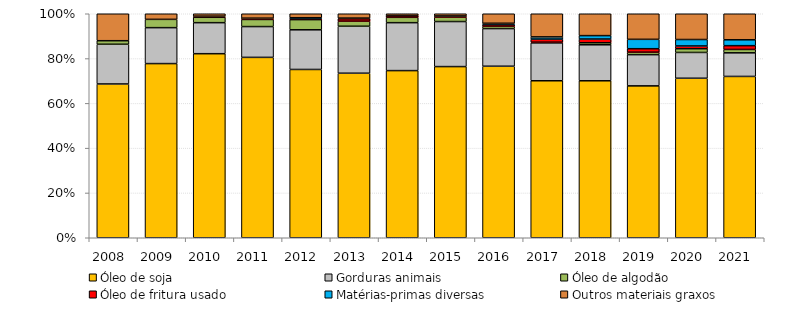
| Category | Óleo de soja | Gorduras animais | Óleo de algodão | Óleo de fritura usado | Matérias-primas diversas | Outros materiais graxos |
|---|---|---|---|---|---|---|
| 2008.0 | 0.687 | 0.177 | 0.016 | 0 | 0 | 0.12 |
| 2009.0 | 0.778 | 0.16 | 0.037 | 0 | 0 | 0.025 |
| 2010.0 | 0.822 | 0.139 | 0.024 | 0.002 | 0.003 | 0.011 |
| 2011.0 | 0.805 | 0.138 | 0.032 | 0.005 | 0.001 | 0.02 |
| 2012.0 | 0.751 | 0.177 | 0.045 | 0.007 | 0.002 | 0.018 |
| 2013.0 | 0.735 | 0.21 | 0.023 | 0.011 | 0.003 | 0.019 |
| 2014.0 | 0.746 | 0.214 | 0.024 | 0.008 | 0 | 0.008 |
| 2015.0 | 0.764 | 0.201 | 0.02 | 0.004 | 0.001 | 0.01 |
| 2016.0 | 0.766 | 0.168 | 0.011 | 0.007 | 0.006 | 0.042 |
| 2017.0 | 0.701 | 0.169 | 0.003 | 0.014 | 0.01 | 0.103 |
| 2018.0 | 0.701 | 0.161 | 0.009 | 0.017 | 0.015 | 0.098 |
| 2019.0 | 0.678 | 0.139 | 0.011 | 0.016 | 0.042 | 0.114 |
| 2020.0 | 0.712 | 0.115 | 0.017 | 0.012 | 0.029 | 0.115 |
| 2021.0 | 0.72 | 0.105 | 0.015 | 0.017 | 0.026 | 0.116 |